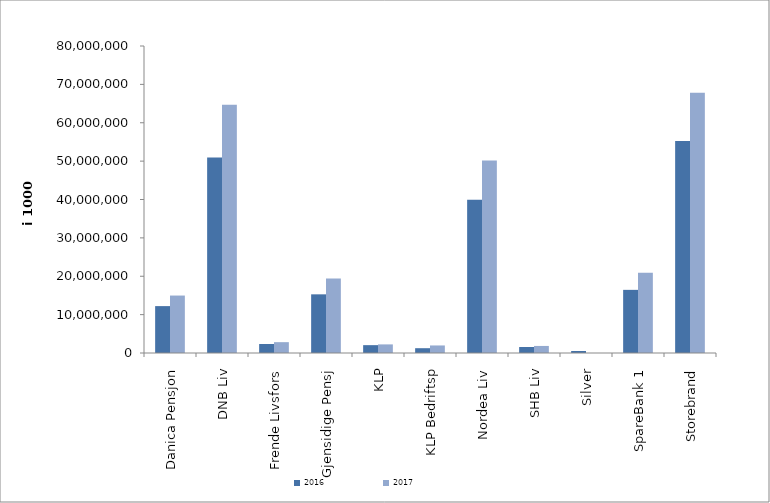
| Category | 2016 | 2017 |
|---|---|---|
| 0 | 12219937.159 | 14971198.461 |
| 1 | 50966960.75 | 64688136 |
| 2 | 2340738 | 2825243 |
| 3 | 15287381.192 | 19415872 |
| 4 | 2046847.926 | 2241526.471 |
| 5 | 1251557 | 1965832 |
| 6 | 39964500 | 50143350 |
| 7 | 1556437 | 1836877 |
| 8 | 524253.462 | 0 |
| 9 | 16453474.357 | 20880311.993 |
| 10 | 55234944.389 | 67802748.373 |